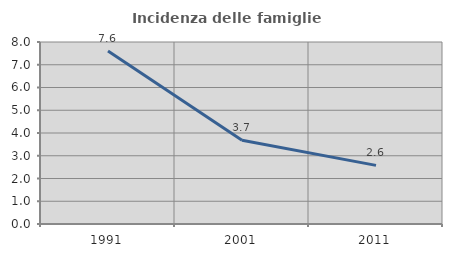
| Category | Incidenza delle famiglie numerose |
|---|---|
| 1991.0 | 7.605 |
| 2001.0 | 3.68 |
| 2011.0 | 2.578 |